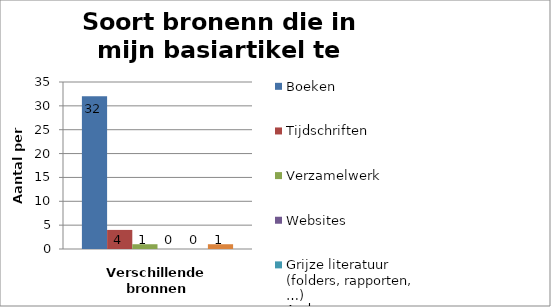
| Category | Boeken | Tijdschriften | Verzamelwerk | Websites | Grijze literatuur (folders, rapporten, …) | Andere |
|---|---|---|---|---|---|---|
| Aantal | 32 | 4 | 1 | 0 | 0 | 1 |